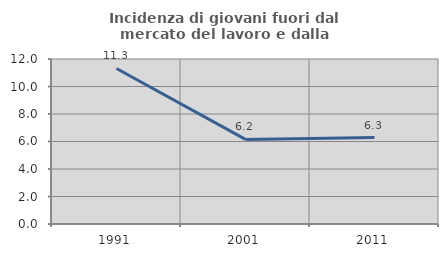
| Category | Incidenza di giovani fuori dal mercato del lavoro e dalla formazione  |
|---|---|
| 1991.0 | 11.31 |
| 2001.0 | 6.154 |
| 2011.0 | 6.286 |